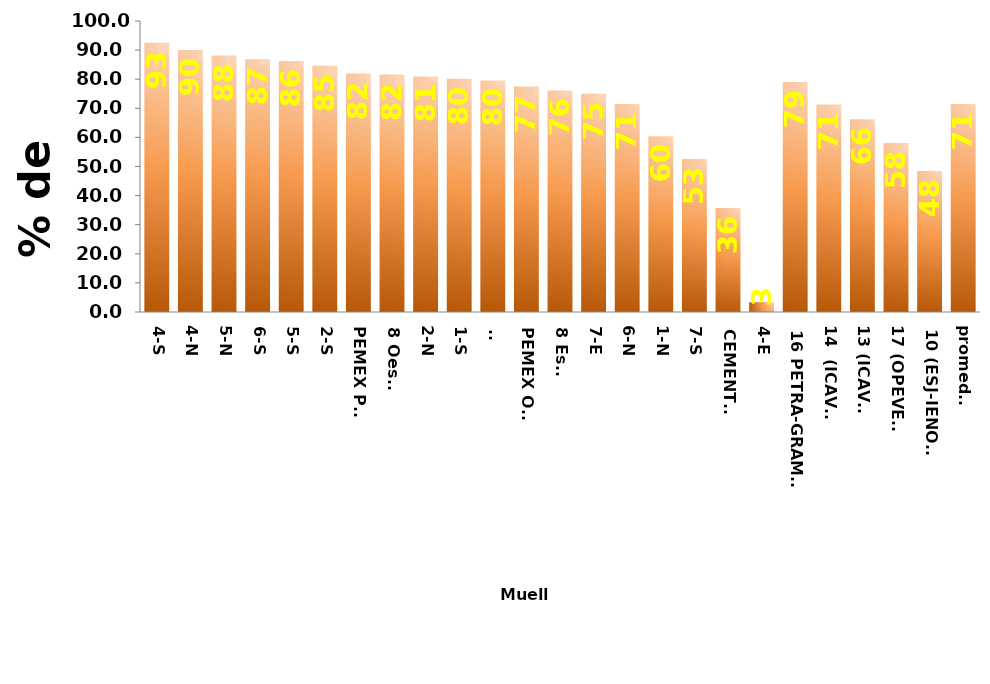
| Category | ene-jul 2023 |
|---|---|
| 4-S | 92.567 |
| 4-N | 90.055 |
| 5-N | 88.123 |
| 6-S | 86.848 |
| 5-S | 86.242 |
| 2-S | 84.59 |
| PEMEX PTE | 81.927 |
| 8 Oeste | 81.584 |
| 2-N | 80.943 |
| 1-S | 80.166 |
| 9- | 79.581 |
| PEMEX OTE | 77.478 |
| 8 Este | 76.144 |
| 7-E | 75.041 |
| 6-N | 71.454 |
| 1-N | 60.408 |
| 7-S | 52.595 |
| CEMENTOS | 35.721 |
| 4-E | 3.369 |
| 16 PETRA-GRAMOSA | 79.065 |
| 14  (ICAVE) | 71.316 |
| 13 (ICAVE) | 66.255 |
| 17 (OPEVER) | 58.09 |
| 10 (ESJ-IENOVA) | 48.426 |
| promedio | 71.441 |